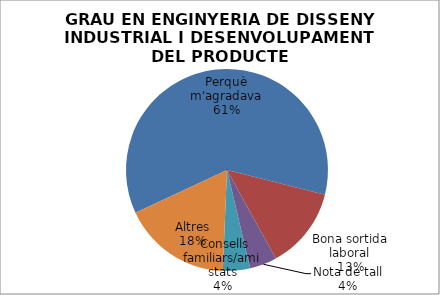
| Category | GRAU EN ENGINYERIA DE DISSENY INDUSTRIAL I DESENVOLUPAMENT DEL PRODUCTE |
|---|---|
| Perquè m'agradava | 14 |
| Bona sortida laboral | 3 |
| S'hi matriculaven les amistats | 0 |
| Nota de tall | 1 |
|  Consells familiars/amistats | 1 |
| Altres | 4 |